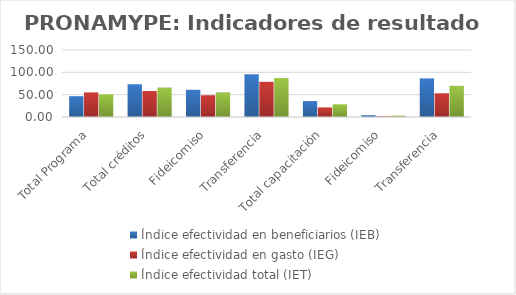
| Category | Índice efectividad en beneficiarios (IEB) | Índice efectividad en gasto (IEG)  | Índice efectividad total (IET) |
|---|---|---|---|
| Total Programa | 46.605 | 55.079 | 50.842 |
| Total créditos | 73.295 | 58.205 | 65.75 |
| Fideicomiso | 60.879 | 48.792 | 54.835 |
| Transferencia | 95.723 | 78.738 | 87.231 |
| Total capacitación | 35.624 | 21.421 | 28.523 |
| Fideicomiso | 3.993 | 1.726 | 2.86 |
| Transferencia | 86.453 | 53.065 | 69.759 |